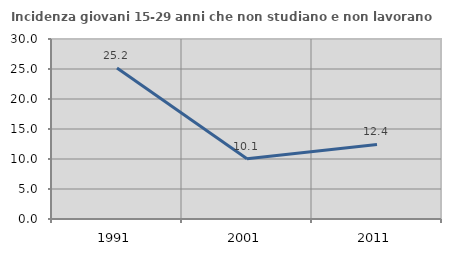
| Category | Incidenza giovani 15-29 anni che non studiano e non lavorano  |
|---|---|
| 1991.0 | 25.163 |
| 2001.0 | 10.052 |
| 2011.0 | 12.419 |